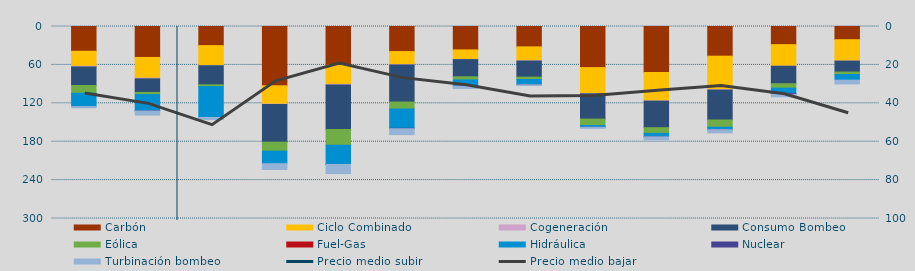
| Category | Carbón | Ciclo Combinado | Cogeneración | Consumo Bombeo | Eólica | Fuel-Gas | Hidráulica | Nuclear | Turbinación bombeo |
|---|---|---|---|---|---|---|---|---|---|
| N | 38654 | 23471.9 | 1088.5 | 28952.2 | 12138.1 | 0 | 20858.9 | 0 | 1910.4 |
| D | 48332.5 | 32343 | 1137.1 | 21197.2 | 3426.7 | 0 | 25403.7 | 222 | 6361.9 |
| E | 29873.4 | 31257.5 | 232.7 | 29718.6 | 2813.5 | 0 | 48230.3 | 0 | 3337.1 |
| F | 92635.5 | 28594.2 | 463.1 | 59071.9 | 13978.3 | 0 | 19654.8 | 0 | 9063.5 |
| M | 60556.8 | 29853.7 | 1006.6 | 69541.7 | 24572.7 | 0 | 29936.2 | 30 | 14315.8 |
| A | 39185.7 | 20218.6 | 667 | 58045.1 | 10784.5 | 0 | 30176.3 | 635.3 | 9263.7 |
| M | 36573.1 | 14965.8 | 259.5 | 26811.1 | 4780.9 | 0 | 9611.3 | 138 | 3683.8 |
| J | 31856.5 | 21784.2 | 332.6 | 25120.8 | 3742.7 | 0 | 7869.8 | 320 | 1244.9 |
| J | 64224.4 | 40730.5 | 223.6 | 39459.7 | 10048.7 | 0 | 2606.4 | 130 | 1680.4 |
| A | 71875.8 | 44407.8 | 356.8 | 41443.4 | 8916.4 | 0 | 5181.1 | 179.2 | 4517 |
| S | 46377.5 | 52485.1 | 420.2 | 46799.1 | 11262.5 | 0 | 3698.4 | 178.3 | 4969.7 |
| O | 28352.7 | 33701.8 | 72.5 | 27285.6 | 6968.9 | 0 | 8057.2 | 1524.1 | 3817.1 |
| N | 20637.7 | 33409.3 | 40.8 | 17072.8 | 3847.5 | 0 | 8820.4 | 0 | 5932.4 |